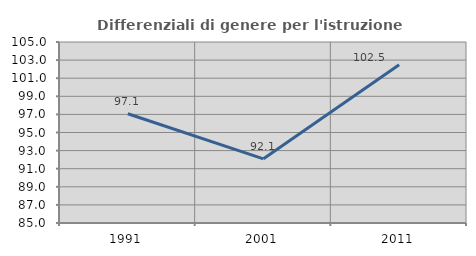
| Category | Differenziali di genere per l'istruzione superiore |
|---|---|
| 1991.0 | 97.069 |
| 2001.0 | 92.093 |
| 2011.0 | 102.479 |